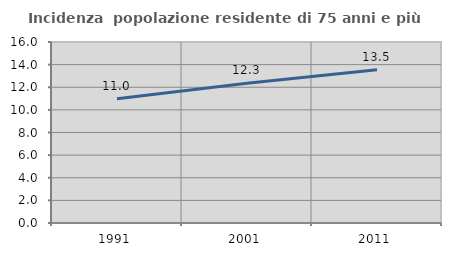
| Category | Incidenza  popolazione residente di 75 anni e più |
|---|---|
| 1991.0 | 10.976 |
| 2001.0 | 12.344 |
| 2011.0 | 13.545 |